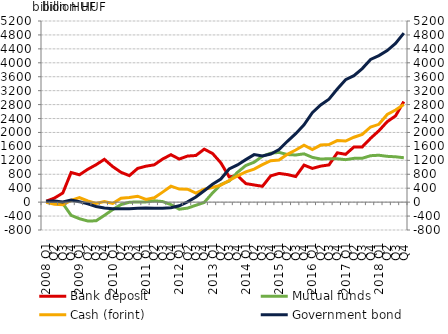
| Category | Bank deposit | Mutual funds | Cash (forint) |
|---|---|---|---|
| 2008 Q1 | 25.327 | 26.165 | -6.424 |
| Q2 | 117.161 | -14.599 | -61.286 |
| Q3 | 261.842 | -38.376 | -74.693 |
| Q4 | 851.283 | -379.05 | 49.128 |
| 2009 Q1 | 784.766 | -476.11 | 133.232 |
| Q2 | 942.105 | -540.979 | 32.935 |
| Q3 | 1073.853 | -536.509 | -38.033 |
| Q4 | 1228.285 | -380.531 | 17.963 |
| 2010 Q1 | 1020.36 | -213.951 | -37.533 |
| Q2 | 856.15 | -69.989 | 112.797 |
| Q3 | 760.729 | -3.064 | 130.081 |
| Q4 | 968.021 | 5.307 | 170.724 |
| 2011 Q1 | 1032.297 | 6.968 | 75.424 |
| Q2 | 1072.14 | 38.963 | 123.31 |
| Q3 | 1236.915 | 16.305 | 287.322 |
| Q4 | 1361.632 | -70.24 | 457.801 |
| 2012 Q1 | 1236.398 | -202.446 | 374.223 |
| Q2 | 1323.103 | -172.071 | 370.113 |
| Q3 | 1338.744 | -89.3 | 261.688 |
| Q4 | 1520.475 | -10.203 | 372.37 |
| 2013 Q1 | 1397.917 | 263.554 | 418.356 |
| Q2 | 1128.168 | 506.175 | 486.904 |
| Q3 | 725.162 | 605.191 | 621.351 |
| Q4 | 763.737 | 855.499 | 753.883 |
| 2014 Q1 | 532.142 | 1051.948 | 866.443 |
| Q2 | 492.766 | 1145.231 | 949.592 |
| Q3 | 454.417 | 1318.321 | 1074.475 |
| Q4 | 754.158 | 1404.686 | 1190.892 |
| 2015 Q1 | 824.186 | 1428.23 | 1207.232 |
| Q2 | 791.412 | 1365.979 | 1372.376 |
| Q3 | 734.852 | 1353.345 | 1496.949 |
| Q4 | 1063.284 | 1386.365 | 1634.006 |
| 2016 Q1 | 967.906 | 1285.564 | 1508.942 |
| Q2 | 1033.243 | 1237.106 | 1638.509 |
| Q3 | 1068.691 | 1247.044 | 1652.239 |
| Q4 | 1415.314 | 1245.201 | 1768.412 |
| 2017 Q1 | 1372.884 | 1219.035 | 1752.796 |
| Q2 | 1583.333 | 1256.159 | 1863.615 |
| Q3 | 1585.634 | 1259.364 | 1947.138 |
| Q4 | 1832.73 | 1332.867 | 2157.482 |
| 2018 Q1 | 2048.349 | 1346.313 | 2233.973 |
| Q2 | 2309.782 | 1314.603 | 2514.868 |
| Q3 | 2474.589 | 1301.768 | 2644.413 |
| Q4 | 2886.359 | 1274.645 | 2801.327 |